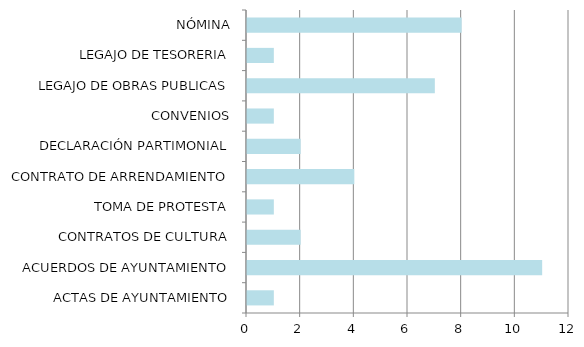
| Category | Series 0 |
|---|---|
| ACTAS DE AYUNTAMIENTO | 1 |
| ACUERDOS DE AYUNTAMIENTO | 11 |
| CONTRATOS DE CULTURA | 2 |
| TOMA DE PROTESTA | 1 |
| CONTRATO DE ARRENDAMIENTO | 4 |
| DECLARACIÓN PARTIMONIAL | 2 |
| CONVENIOS | 1 |
| LEGAJO DE OBRAS PUBLICAS | 7 |
| LEGAJO DE TESORERIA | 1 |
| NÓMINA | 8 |